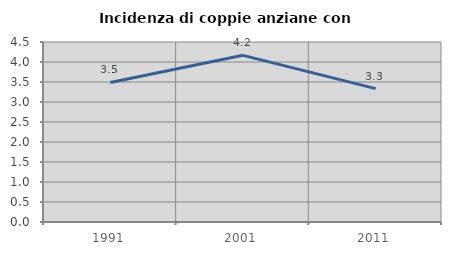
| Category | Incidenza di coppie anziane con figli |
|---|---|
| 1991.0 | 3.488 |
| 2001.0 | 4.167 |
| 2011.0 | 3.333 |